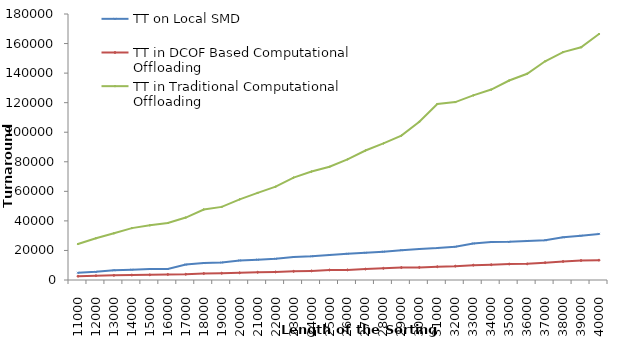
| Category | TT on Local SMD   | TT in DCOF Based Computational Offloading | TT in Traditional Computational Offloading  |
|---|---|---|---|
| 11000.0 | 4876 | 2559 | 24331 |
| 12000.0 | 5510 | 2902 | 28267 |
| 13000.0 | 6566 | 3132 | 31609 |
| 14000.0 | 6989 | 3345 | 35115 |
| 15000.0 | 7406 | 3494 | 37010 |
| 16000.0 | 7450 | 3757 | 38571 |
| 17000.0 | 10414 | 3888 | 42244 |
| 18000.0 | 11457 | 4379 | 47714 |
| 19000.0 | 11857 | 4579 | 49481 |
| 20000.0 | 13221 | 4864 | 54599 |
| 21000.0 | 13774 | 5222 | 58953 |
| 22000.0 | 14410 | 5461 | 63141 |
| 23000.0 | 15579 | 5838 | 69280 |
| 24000.0 | 16059 | 6171 | 73368 |
| 25000.0 | 16950 | 6770 | 76615 |
| 26000.0 | 17764 | 6844 | 81668 |
| 27000.0 | 18421 | 7377 | 87634 |
| 28000.0 | 19176 | 7885 | 92439 |
| 29000.0 | 20179 | 8436 | 97729 |
| 30000.0 | 20987 | 8525 | 107042 |
| 31000.0 | 21600 | 8989 | 119084 |
| 32000.0 | 22565 | 9378 | 120380 |
| 33000.0 | 24701 | 10042 | 124931 |
| 34000.0 | 25687 | 10328 | 128864 |
| 35000.0 | 25825 | 10790 | 135006 |
| 36000.0 | 26432 | 10914 | 139564 |
| 37000.0 | 26910 | 11704 | 148009 |
| 38000.0 | 28859 | 12537 | 154216 |
| 39000.0 | 29968 | 13182 | 157490 |
| 40000.0 | 31207 | 13416 | 166457 |